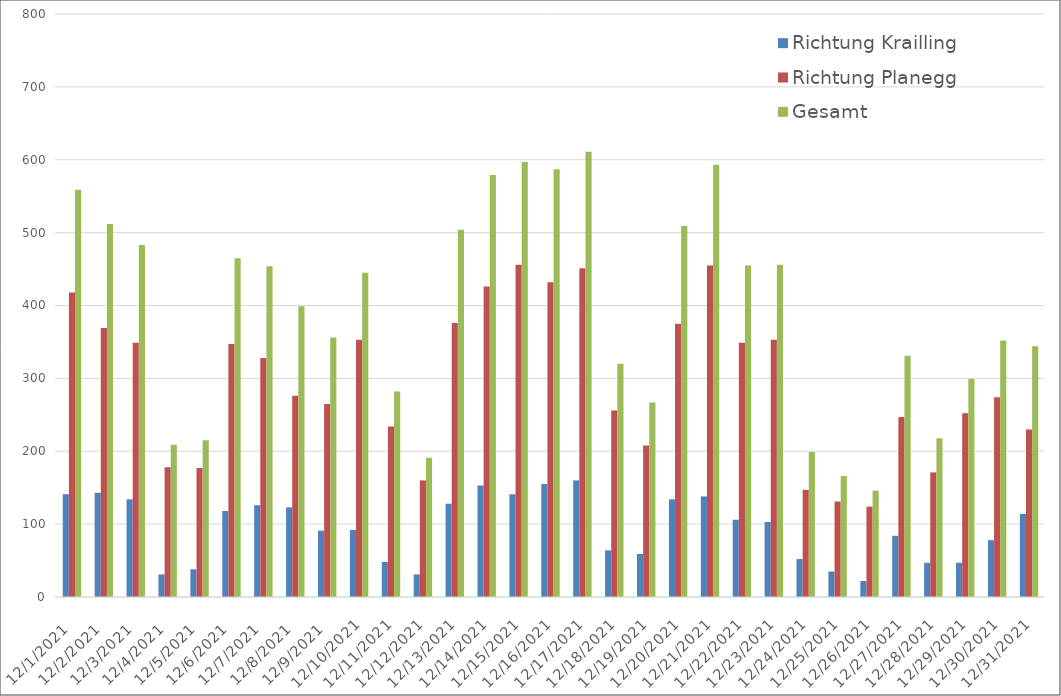
| Category | Richtung Krailling | Richtung Planegg | Gesamt |
|---|---|---|---|
| 12/1/21 | 141 | 418 | 559 |
| 12/2/21 | 143 | 369 | 512 |
| 12/3/21 | 134 | 349 | 483 |
| 12/4/21 | 31 | 178 | 209 |
| 12/5/21 | 38 | 177 | 215 |
| 12/6/21 | 118 | 347 | 465 |
| 12/7/21 | 126 | 328 | 454 |
| 12/8/21 | 123 | 276 | 399 |
| 12/9/21 | 91 | 265 | 356 |
| 12/10/21 | 92 | 353 | 445 |
| 12/11/21 | 48 | 234 | 282 |
| 12/12/21 | 31 | 160 | 191 |
| 12/13/21 | 128 | 376 | 504 |
| 12/14/21 | 153 | 426 | 579 |
| 12/15/21 | 141 | 456 | 597 |
| 12/16/21 | 155 | 432 | 587 |
| 12/17/21 | 160 | 451 | 611 |
| 12/18/21 | 64 | 256 | 320 |
| 12/19/21 | 59 | 208 | 267 |
| 12/20/21 | 134 | 375 | 509 |
| 12/21/21 | 138 | 455 | 593 |
| 12/22/21 | 106 | 349 | 455 |
| 12/23/21 | 103 | 353 | 456 |
| 12/24/21 | 52 | 147 | 199 |
| 12/25/21 | 35 | 131 | 166 |
| 12/26/21 | 22 | 124 | 146 |
| 12/27/21 | 84 | 247 | 331 |
| 12/28/21 | 47 | 171 | 218 |
| 12/29/21 | 47 | 252 | 299 |
| 12/30/21 | 78 | 274 | 352 |
| 12/31/21 | 114 | 230 | 344 |